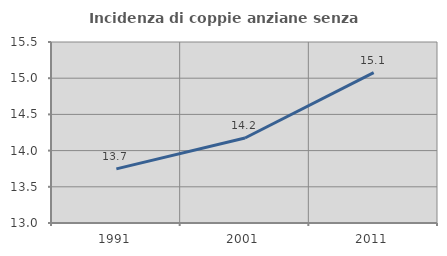
| Category | Incidenza di coppie anziane senza figli  |
|---|---|
| 1991.0 | 13.747 |
| 2001.0 | 14.174 |
| 2011.0 | 15.076 |